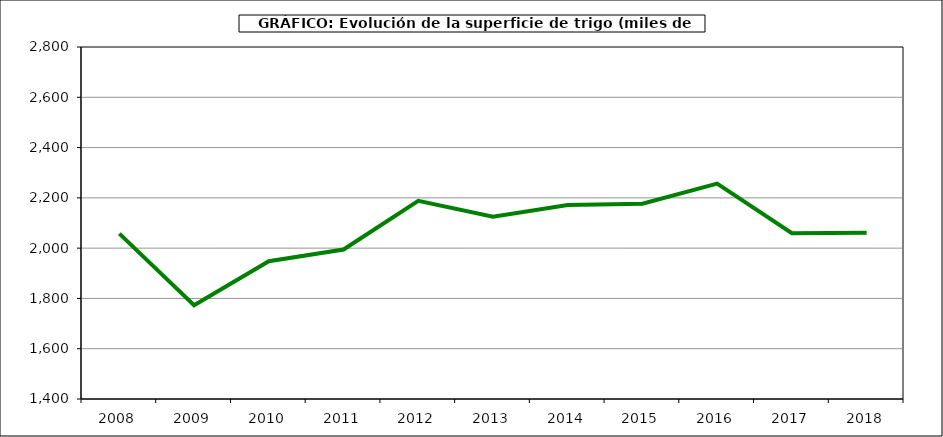
| Category | Superficie |
|---|---|
| 2008.0 | 2057.87 |
| 2009.0 | 1772.752 |
| 2010.0 | 1948.073 |
| 2011.0 | 1994.653 |
| 2012.0 | 2188.171 |
| 2013.0 | 2124.969 |
| 2014.0 | 2171.672 |
| 2015.0 | 2176.353 |
| 2016.0 | 2256.848 |
| 2017.0 | 2059.224 |
| 2018.0 | 2061.5 |